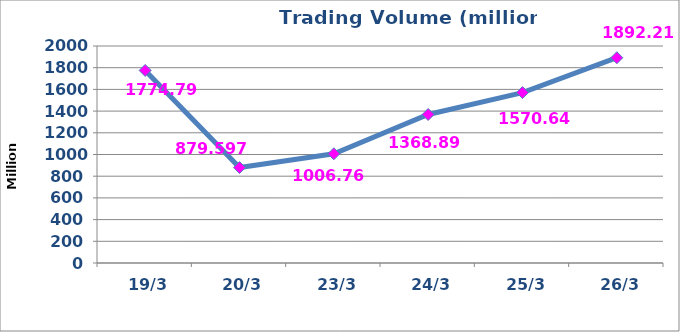
| Category | القيمة المتداولة |
|---|---|
|  19/3 | 1774795133 |
|  20/3 | 879597139 |
|  23/3 | 1006768282 |
|  24/3 | 1368897526 |
|  25/3 | 1570639776 |
|  26/3 | 1892218127 |